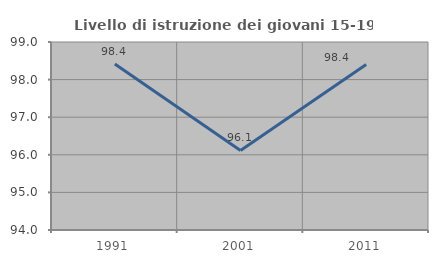
| Category | Livello di istruzione dei giovani 15-19 anni |
|---|---|
| 1991.0 | 98.413 |
| 2001.0 | 96.117 |
| 2011.0 | 98.4 |